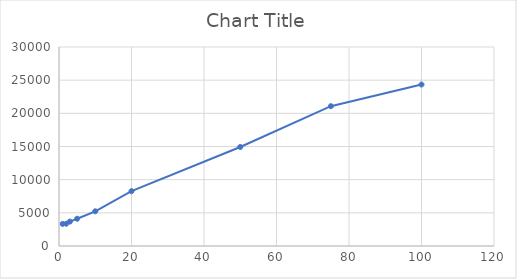
| Category | Series 0 |
|---|---|
| 1.0 | 3330.956 |
| 2.0 | 3361.318 |
| 3.0 | 3683.156 |
| 5.0 | 4108.226 |
| 10.0 | 5230.954 |
| 20.0 | 8263.688 |
| 50.0 | 14928.826 |
| 75.0 | 21078.554 |
| 100.0 | 24343.503 |